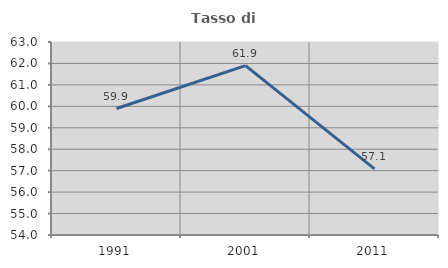
| Category | Tasso di occupazione   |
|---|---|
| 1991.0 | 59.898 |
| 2001.0 | 61.896 |
| 2011.0 | 57.085 |